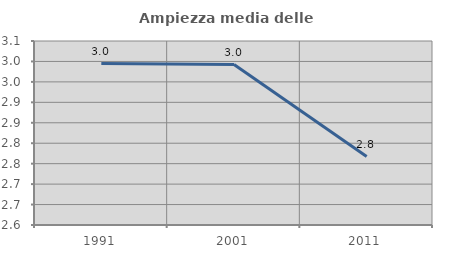
| Category | Ampiezza media delle famiglie |
|---|---|
| 1991.0 | 2.995 |
| 2001.0 | 2.992 |
| 2011.0 | 2.767 |